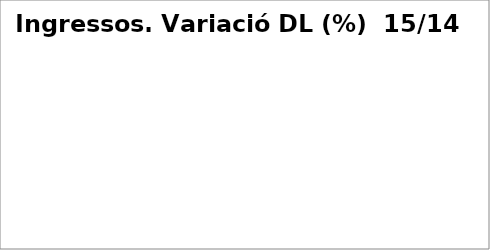
| Category | Series 0 |
|---|---|
| Impostos directes | 0.061 |
| Impostos indirectes | 0.147 |
| Taxes, preus públics i altres ingressos | -0.046 |
| Transferències corrents | 0.061 |
| Ingressos patrimonials | 0.775 |
| Venda d'inversions reals | 0 |
| Transferències de capital | -0.284 |
| Actius financers* | 0 |
| Passius financers | 0.233 |